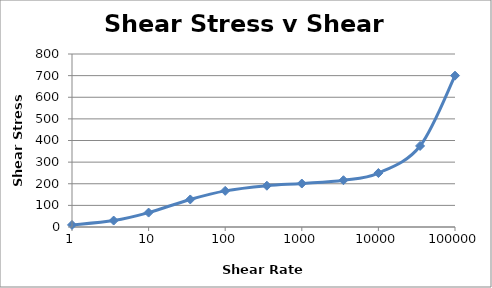
| Category | Stress N/m2 |
|---|---|
| 1.0 | 9.524 |
| 3.5 | 29.79 |
| 10.0 | 66.683 |
| 35.0 | 127.384 |
| 100.0 | 167.083 |
| 350.0 | 190.845 |
| 1000.0 | 200.98 |
| 3500.0 | 216.264 |
| 10000.0 | 249.501 |
| 35000.0 | 374.786 |
| 100000.0 | 699.86 |